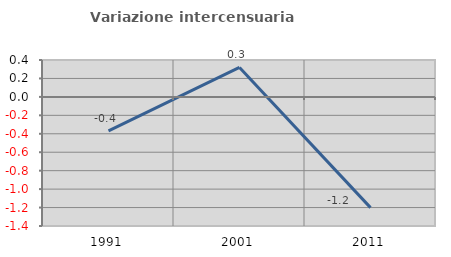
| Category | Variazione intercensuaria annua |
|---|---|
| 1991.0 | -0.369 |
| 2001.0 | 0.319 |
| 2011.0 | -1.201 |